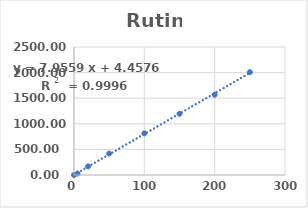
| Category | Series 0 |
|---|---|
| 0.0 | 0 |
| 5.0 | 28.923 |
| 20.0 | 168.688 |
| 50.0 | 418.837 |
| 100.0 | 813.014 |
| 150.0 | 1196.071 |
| 200.0 | 1567.744 |
| 250.0 | 2008.2 |